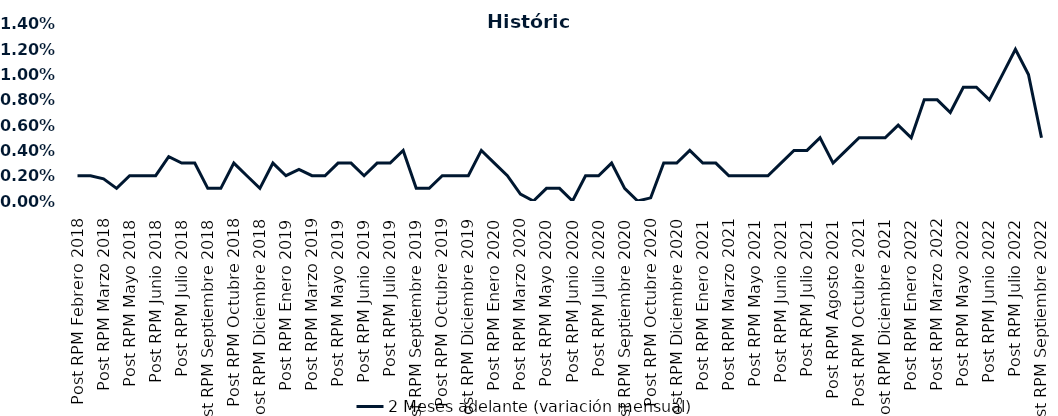
| Category | 2 Meses adelante (variación mensual) |
|---|---|
| Post RPM Febrero 2018 | 0.002 |
| Pre RPM Marzo 2018 | 0.002 |
| Post RPM Marzo 2018 | 0.002 |
| Pre RPM Mayo 2018 | 0.001 |
| Post RPM Mayo 2018 | 0.002 |
| Pre RPM Junio 2018 | 0.002 |
| Post RPM Junio 2018 | 0.002 |
| Pre RPM Julio 2018 | 0.004 |
| Post RPM Julio 2018 | 0.003 |
| Pre RPM Septiembre 2018 | 0.003 |
| Post RPM Septiembre 2018 | 0.001 |
| Pre RPM Octubre 2018 | 0.001 |
| Post RPM Octubre 2018 | 0.003 |
| Pre RPM Diciembre 2018 | 0.002 |
| Post RPM Diciembre 2018 | 0.001 |
| Pre RPM Enero 2019 | 0.003 |
| Post RPM Enero 2019 | 0.002 |
| Pre RPM Marzo 2019 | 0.002 |
| Post RPM Marzo 2019 | 0.002 |
| Pre RPM Mayo 2019 | 0.002 |
| Post RPM Mayo 2019 | 0.003 |
| Pre RPM Junio 2019 | 0.003 |
| Post RPM Junio 2019 | 0.002 |
| Pre RPM Julio 2019 | 0.003 |
| Post RPM Julio 2019 | 0.003 |
| Pre RPM Septiembre 2019 | 0.004 |
| Post RPM Septiembre 2019 | 0.001 |
| Pre RPM Octubre 2019 | 0.001 |
| Post RPM Octubre 2019 | 0.002 |
| Pre RPM Diciembre 2019 | 0.002 |
| Post RPM Diciembre 2019 | 0.002 |
| Pre RPM Enero 2020 | 0.004 |
| Post RPM Enero 2020 | 0.003 |
| Pre RPM Marzo 2020 | 0.002 |
| Post RPM Marzo 2020 | 0.001 |
| Pre RPM Mayo 2020 | 0 |
| Post RPM Mayo 2020 | 0.001 |
| Pre RPM Junio 2020 | 0.001 |
| Post RPM Junio 2020 | 0 |
| Pre RPM Julio 2020 | 0.002 |
| Post RPM Julio 2020 | 0.002 |
| Pre RPM Septiembre 2020 | 0.003 |
| Post RPM Septiembre 2020 | 0.001 |
| Pre RPM Octubre 2020 | 0 |
| Post RPM Octubre 2020 | 0 |
| Pre RPM Diciembre 2020 | 0.003 |
| Post RPM Diciembre 2020 | 0.003 |
| Pre RPM Enero 2021 | 0.004 |
| Post RPM Enero 2021 | 0.003 |
| Pre RPM Marzo 2021 | 0.003 |
| Post RPM Marzo 2021 | 0.002 |
| Pre RPM Mayo 2021 | 0.002 |
| Post RPM Mayo 2021 | 0.002 |
| Pre RPM Junio 2021 | 0.002 |
| Post RPM Junio 2021 | 0.003 |
| Pre RPM Julio 2021 | 0.004 |
| Post RPM Julio 2021 | 0.004 |
| Pre RPM Agosto 2021 | 0.005 |
| Post RPM Agosto 2021 | 0.003 |
| Pre RPM Octubre 2021 | 0.004 |
| Post RPM Octubre 2021 | 0.005 |
| Pre RPM Diciembre 2021 | 0.005 |
| Post RPM Diciembre 2021 | 0.005 |
| Pre RPM Enero 2022 | 0.006 |
| Post RPM Enero 2022 | 0.005 |
| Pre RPM Marzo 2022 | 0.008 |
| Post RPM Marzo 2022 | 0.008 |
| Pre RPM Mayo 2022 | 0.007 |
| Post RPM Mayo 2022 | 0.009 |
| Pre RPM Junio 2022 | 0.009 |
| Post RPM Junio 2022 | 0.008 |
| Pre RPM Julio 2022 | 0.01 |
| Post RPM Julio 2022 | 0.012 |
| Pre RPM Septiembre 2022 | 0.01 |
| Post RPM Septiembre 2022 | 0.005 |